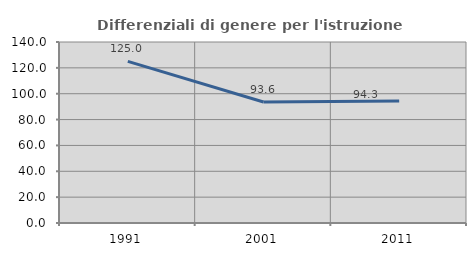
| Category | Differenziali di genere per l'istruzione superiore |
|---|---|
| 1991.0 | 124.975 |
| 2001.0 | 93.576 |
| 2011.0 | 94.318 |